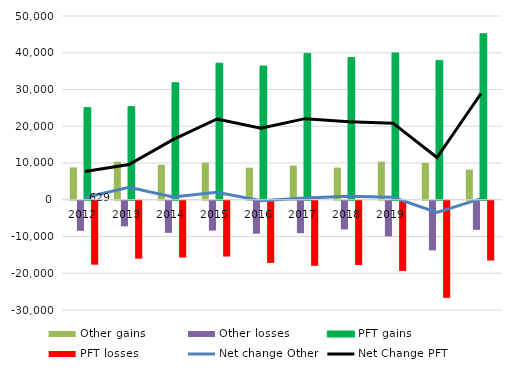
| Category | Other gains | Other losses | PFT gains | PFT losses |
|---|---|---|---|---|
| 2012.0 | 8811 | -8182 | 25079 | -17398 |
| 2013.0 | 10357 | -6970 | 25346 | -15759 |
| 2014.0 | 9503 | -8726 | 31824 | -15452 |
| 2015.0 | 10125 | -8115 | 37160 | -15179 |
| 2016.0 | 8739 | -8978 | 36378 | -16916 |
| 2017.0 | 9310 | -8833 | 39769 | -17702 |
| 2018.0 | 8750 | -7806 | 38706 | -17484 |
| 2019.0 | 10382 | -9697 | 39946 | -19102 |